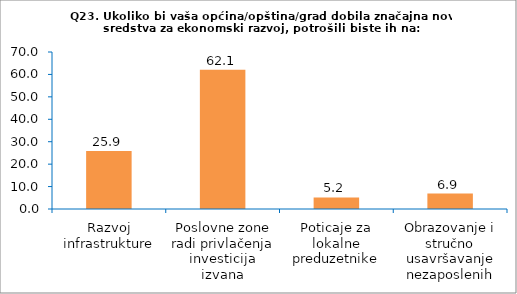
| Category | Series 0 |
|---|---|
| Razvoj infrastrukture | 25.862 |
| Poslovne zone radi privlačenja investicija izvana | 62.069 |
| Poticaje za lokalne preduzetnike | 5.172 |
| Obrazovanje i stručno usavršavanje nezaposlenih | 6.897 |